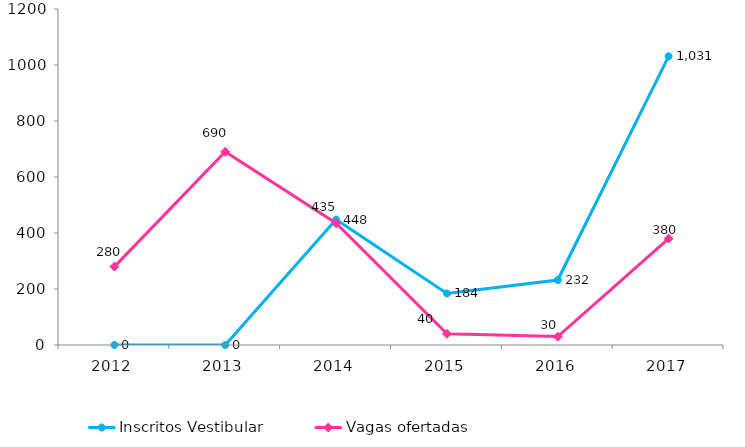
| Category | Inscritos Vestibular |
|---|---|
| 2012.0 | 0 |
| 2013.0 | 0 |
| 2014.0 | 448 |
| 2015.0 | 184 |
| 2016.0 | 232 |
| 2017.0 | 1031 |